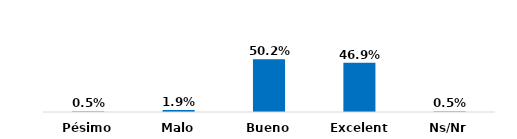
| Category | Series 0 |
|---|---|
| Pésimo | 0.005 |
| Malo | 0.019 |
| Bueno | 0.502 |
| Excelente | 0.469 |
| Ns/Nr | 0.005 |